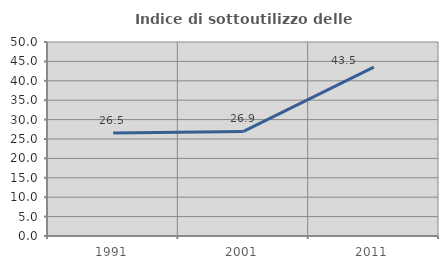
| Category | Indice di sottoutilizzo delle abitazioni  |
|---|---|
| 1991.0 | 26.519 |
| 2001.0 | 26.946 |
| 2011.0 | 43.548 |